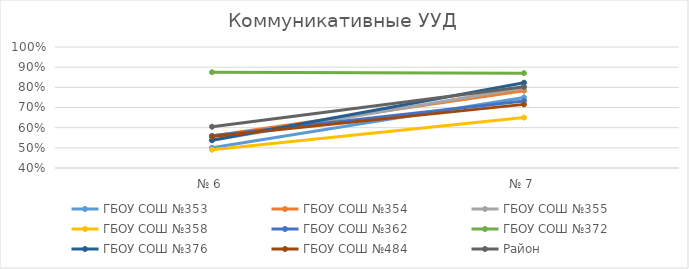
| Category | ГБОУ СОШ №353 | ГБОУ СОШ №354 | ГБОУ СОШ №355 | ГБОУ СОШ №358  | ГБОУ СОШ №362 | ГБОУ СОШ №372 | ГБОУ СОШ №376 | ГБОУ СОШ №484 | Район |
|---|---|---|---|---|---|---|---|---|---|
| № 6 | 0.5 | 0.558 | 0.537 | 0.49 | 0.559 | 0.875 | 0.538 | 0.556 | 0.605 |
| № 7 | 0.75 | 0.783 | 0.798 | 0.65 | 0.733 | 0.87 | 0.823 | 0.716 | 0.803 |